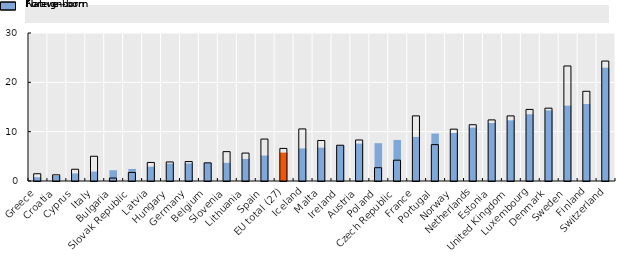
| Category | Foreign-born | Native-born |
|---|---|---|
| Greece | 0.757 | 1.475 |
| Croatia | 1.068 | 1.256 |
| Cyprus | 1.533 | 2.381 |
| Italy | 1.913 | 5.015 |
| Bulgaria | 2.186 | 0.604 |
| Slovak Republic | 2.445 | 1.739 |
| Latvia | 2.907 | 3.764 |
| Hungary | 3.508 | 3.86 |
| Germany | 3.578 | 3.947 |
| Belgium | 3.65 | 3.683 |
| Slovenia | 3.68 | 5.951 |
| Lithuania | 4.475 | 5.662 |
| Spain | 5.164 | 8.503 |
| EU total (27) | 5.753 | 6.606 |
| Iceland | 6.605 | 10.554 |
| Malta | 6.768 | 8.206 |
| Ireland | 7.217 | 7.252 |
| Austria | 7.582 | 8.316 |
| Poland | 7.665 | 2.697 |
| Czech Republic | 8.319 | 4.22 |
| France | 8.933 | 13.201 |
| Portugal | 9.608 | 7.372 |
| Norway | 9.737 | 10.511 |
| Netherlands | 10.821 | 11.407 |
| Estonia | 11.759 | 12.386 |
| United Kingdom | 12.299 | 13.2 |
| Luxembourg | 13.532 | 14.51 |
| Denmark | 14.319 | 14.763 |
| Sweden | 15.278 | 23.319 |
| Finland | 15.609 | 18.185 |
| Switzerland | 22.953 | 24.313 |